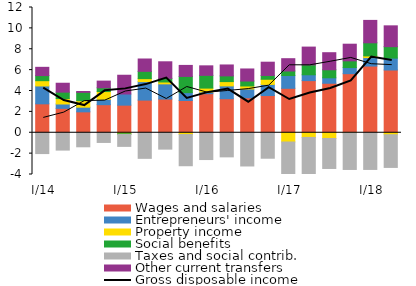
| Category | Wages and salaries | Entrepreneurs' income | Property income | Social benefits  | Taxes and social contrib. | Other current transfers |
|---|---|---|---|---|---|---|
|  I/14 | 2.771 | 1.713 | 0.504 | 0.489 | -1.995 | 0.791 |
| II | 2.338 | 0.418 | 0.516 | 0.619 | -1.661 | 0.853 |
| III | 2.003 | 0.446 | 0.622 | 0.801 | -1.346 | 0.078 |
| IV | 2.689 | 0.515 | 0.744 | 0.361 | -0.929 | 0.639 |
|  I/15 | 2.644 | 1.067 | -0.091 | -0.068 | -1.147 | 1.798 |
| II | 3.127 | 1.772 | 0.285 | 0.699 | -2.453 | 1.182 |
| III | 3.227 | 1.458 | 0.18 | 0.346 | -1.568 | 1.587 |
| IV | 3.087 | 0.757 | -0.172 | 1.551 | -2.987 | 1.055 |
|  I/16 | 3.741 | 0.163 | 0.374 | 1.222 | -2.567 | 0.911 |
| II | 3.262 | 1.228 | 0.411 | 0.546 | -2.311 | 1.047 |
| III | 3.352 | 0.842 | 0.288 | 0.473 | -3.184 | 1.156 |
| IV | 3.566 | 1.066 | 0.492 | 0.365 | -2.44 | 1.271 |
|  I/17 | 4.259 | 1.223 | -0.888 | 0.435 | -3.025 | 1.178 |
| II | 4.994 | 0.559 | -0.446 | 0.949 | -3.959 | 1.705 |
| III | 4.742 | 0.522 | -0.547 | 0.769 | -2.875 | 1.636 |
| IV | 5.66 | 0.585 | -0.003 | 0.643 | -3.514 | 1.596 |
|  I/18 | 6.391 | 0.812 | 0.159 | 1.257 | -3.515 | 2.146 |
| II | 6.011 | 1.141 | -0.191 | 1.097 | -3.132 | 1.993 |